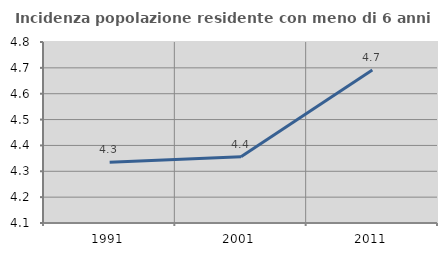
| Category | Incidenza popolazione residente con meno di 6 anni |
|---|---|
| 1991.0 | 4.335 |
| 2001.0 | 4.356 |
| 2011.0 | 4.692 |